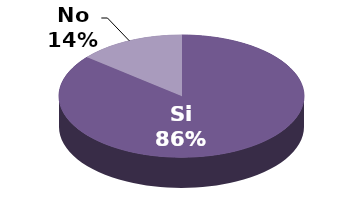
| Category | Series 1 |
|---|---|
| Si | 43 |
| No | 7 |